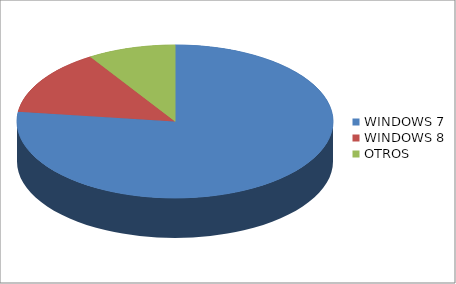
| Category | Series 0 |
|---|---|
| WINDOWS 7 | 0.77 |
| WINDOWS 8 | 0.14 |
| OTROS | 0.09 |